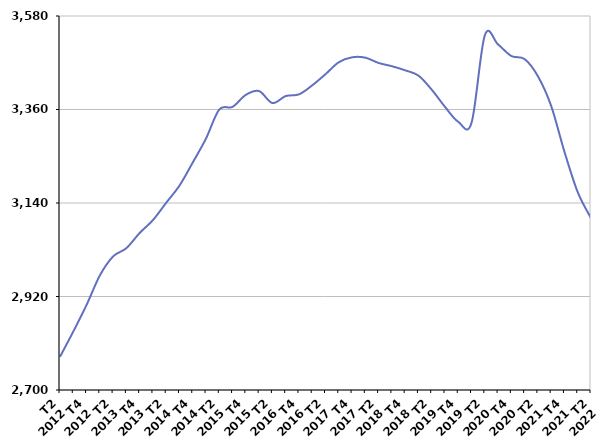
| Category | De 25 à 49 ans |
|---|---|
| T2
2012 | 2778.3 |
| T3
2012 | 2837.5 |
| T4
2012 | 2900.1 |
| T1
2013 | 2969.4 |
| T2
2013 | 3014.3 |
| T3
2013 | 3033.7 |
| T4
2013 | 3069.5 |
| T1
2014 | 3099.7 |
| T2
2014 | 3140.6 |
| T3
2014 | 3180.9 |
| T4
2014 | 3235.3 |
| T1
2015 | 3291.8 |
| T2
2015 | 3360.1 |
| T3
2015 | 3366.2 |
| T4
2015 | 3394.5 |
| T1
2016 | 3403.3 |
| T2
2016 | 3375.2 |
| T3
2016 | 3391.6 |
| T4
2016 | 3395.6 |
| T1
2017 | 3416.8 |
| T2
2017 | 3443.1 |
| T3
2017 | 3471.2 |
| T4
2017 | 3482.8 |
| T1
2018 | 3482 |
| T2
2018 | 3469.5 |
| T3
2018 | 3461.9 |
| T4
2018 | 3452.2 |
| T1
2019 | 3439.8 |
| T2
2019 | 3406.7 |
| T3
2019 | 3366.3 |
| T4
2019 | 3331.1 |
| T1
2020 | 3328.6 |
| T2
2020 | 3534.5 |
| T3
2020 | 3513 |
| T4
2020 | 3485.9 |
| T1
2021 | 3478.6 |
| T2
2021 | 3438.3 |
| T3
2021 | 3368.4 |
| T4
2021 | 3260.6 |
| T1
2022 | 3165.5 |
| T2
2022 | 3104.4 |